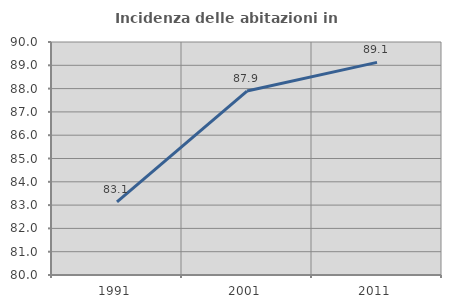
| Category | Incidenza delle abitazioni in proprietà  |
|---|---|
| 1991.0 | 83.137 |
| 2001.0 | 87.893 |
| 2011.0 | 89.127 |